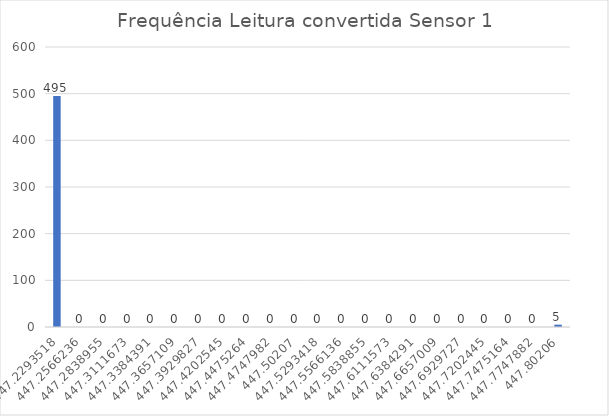
| Category | Series 0 |
|---|---|
| 447.22935181818184 | 495 |
| 447.25662363636366 | 0 |
| 447.2838954545455 | 0 |
| 447.3111672727273 | 0 |
| 447.3384390909091 | 0 |
| 447.3657109090909 | 0 |
| 447.39298272727274 | 0 |
| 447.42025454545455 | 0 |
| 447.44752636363637 | 0 |
| 447.4747981818182 | 0 |
| 447.50207 | 0 |
| 447.5293418181818 | 0 |
| 447.55661363636364 | 0 |
| 447.58388545454545 | 0 |
| 447.61115727272727 | 0 |
| 447.6384290909091 | 0 |
| 447.6657009090909 | 0 |
| 447.6929727272727 | 0 |
| 447.72024454545453 | 0 |
| 447.74751636363635 | 0 |
| 447.77478818181817 | 0 |
| 447.80206 | 5 |